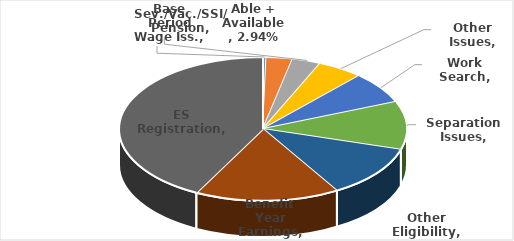
| Category | Series 0 |
|---|---|
| Base Period Wage Iss. | 0.004 |
| Able + Available | 0.029 |
| Sev./Vac./SSI/ Pension | 0.032 |
| Other Issues | 0.052 |
| Work Search | 0.072 |
| Separation Issues | 0.108 |
| Other Eligibility | 0.117 |
| Benefit Year Earnings | 0.162 |
| ES Registration | 0.424 |